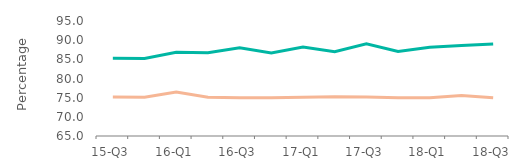
| Category | First-time
buyers | Home movers |
|---|---|---|
| 15-Q3 | 85.28 | 75.15 |
| 15-Q4 | 85.24 | 75.14 |
| 16-Q1 | 86.82 | 76.495 |
| 16-Q2 | 86.75 | 75.14 |
| 16-Q3 | 88.01 | 75 |
| 16-Q4 | 86.67 | 75.01 |
| 17-Q1 | 88.195 | 75.09 |
| 17-Q2 | 86.99 | 75.25 |
| 17-Q3 | 89.07 | 75.18 |
| 17-Q4 | 87.04 | 75 |
| 18-Q1 | 88.165 | 75 |
| 18-Q2 | 88.615 | 75.54 |
| 18-Q3 | 89.01 | 75 |